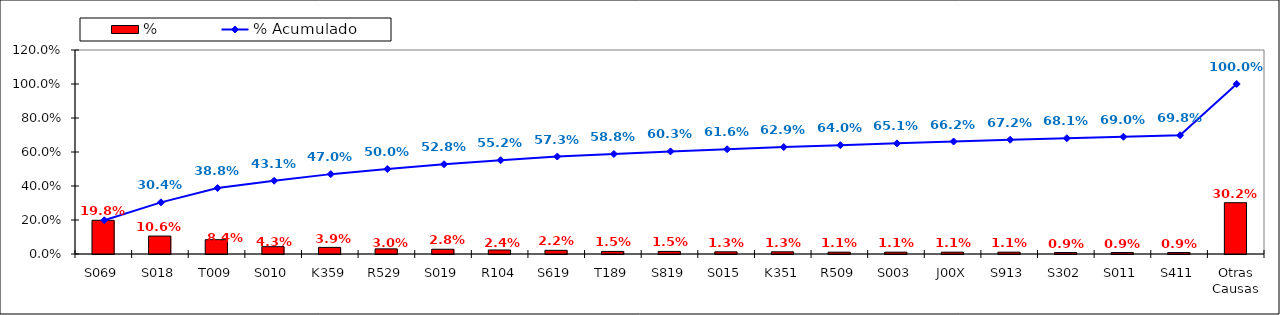
| Category | % |
|---|---|
| S069 | 0.198 |
| S018 | 0.106 |
| T009 | 0.084 |
| S010 | 0.043 |
| K359 | 0.039 |
| R529 | 0.03 |
| S019 | 0.028 |
| R104 | 0.024 |
| S619 | 0.022 |
| T189 | 0.015 |
| S819 | 0.015 |
| S015 | 0.013 |
| K351 | 0.013 |
| R509 | 0.011 |
| S003 | 0.011 |
| J00X | 0.011 |
| S913 | 0.011 |
| S302 | 0.009 |
| S011 | 0.009 |
| S411 | 0.009 |
| Otras Causas | 0.302 |